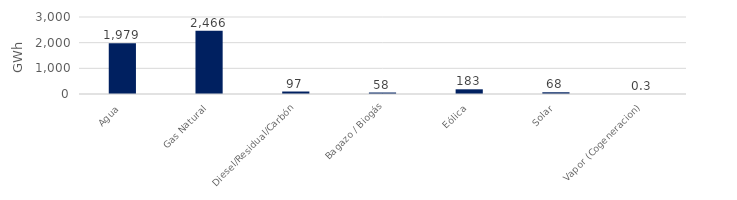
| Category | Series 0 |
|---|---|
| Agua | 1979.272 |
| Gas Natural | 2466.14 |
| Diesel/Residual/Carbón | 96.783 |
| Bagazo / Biogás | 58.09 |
| Eólica | 182.616 |
| Solar | 67.536 |
| Vapor (Cogeneracion) | 0.253 |